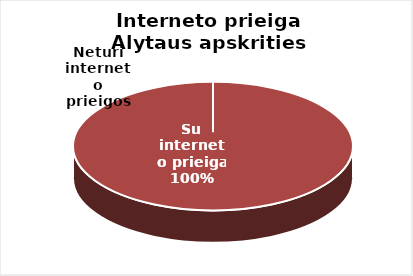
| Category | Series 0 |
|---|---|
| Su interneto prieiga  | 89 |
| Neturi interneto prieigos | 0 |